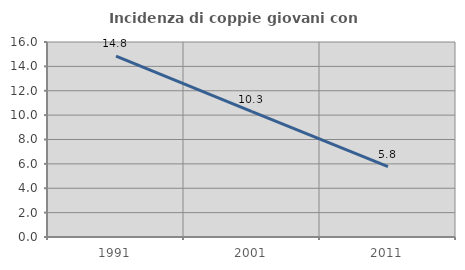
| Category | Incidenza di coppie giovani con figli |
|---|---|
| 1991.0 | 14.841 |
| 2001.0 | 10.287 |
| 2011.0 | 5.782 |